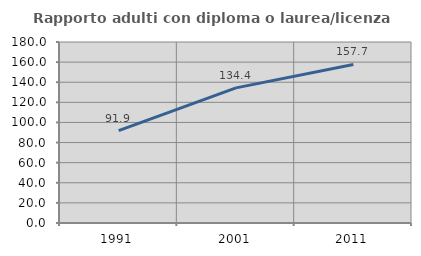
| Category | Rapporto adulti con diploma o laurea/licenza media  |
|---|---|
| 1991.0 | 91.86 |
| 2001.0 | 134.375 |
| 2011.0 | 157.692 |